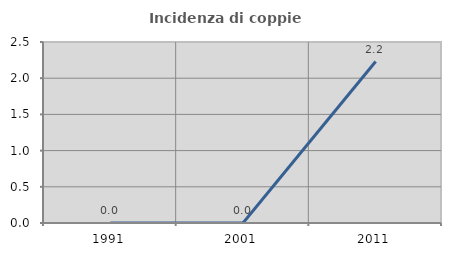
| Category | Incidenza di coppie miste |
|---|---|
| 1991.0 | 0 |
| 2001.0 | 0 |
| 2011.0 | 2.23 |